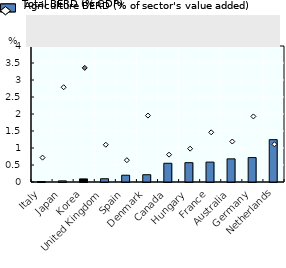
| Category | Agriculture BERD as % of sector's value added |
|---|---|
| Italy | 0.013 |
| Japan | 0.033 |
| Korea | 0.091 |
| United Kingdom | 0.096 |
| Spain | 0.2 |
| Denmark | 0.214 |
| Canada | 0.551 |
| Hungary | 0.569 |
| France | 0.585 |
| Australia | 0.681 |
| Germany | 0.718 |
| Netherlands | 1.245 |